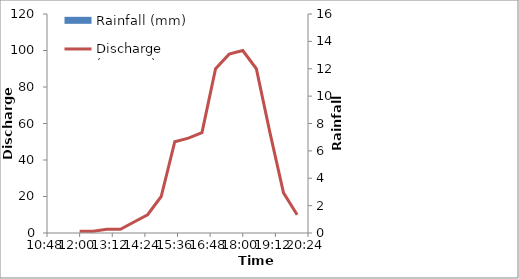
| Category | Rainfall (mm) |
|---|---|
| 0.5 | 0 |
| 0.5208333333333334 | 4 |
| 0.5416666666666666 | 3 |
| 0.5625 | 10 |
| 0.5833333333333334 | 4 |
| 0.604166666666667 | 6 |
| 0.625 | 13 |
| 0.645833333333333 | 15 |
| 0.666666666666667 | 9 |
| 0.6875 | 3 |
| 0.708333333333334 | 0 |
| 0.729166666666667 | 0 |
| 0.75 | 0 |
| 0.770833333333334 | 0 |
| 0.791666666666667 | 0 |
| 0.8125 | 0 |
| 0.833333333333334 | 0 |